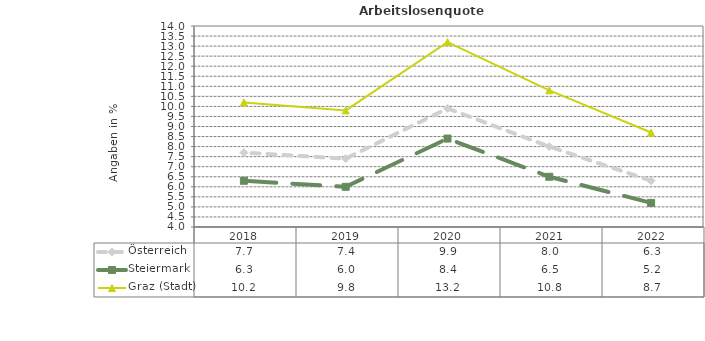
| Category | Österreich | Steiermark | Graz (Stadt) |
|---|---|---|---|
| 2022.0 | 6.3 | 5.2 | 8.7 |
| 2021.0 | 8 | 6.5 | 10.8 |
| 2020.0 | 9.9 | 8.4 | 13.2 |
| 2019.0 | 7.4 | 6 | 9.8 |
| 2018.0 | 7.7 | 6.3 | 10.2 |